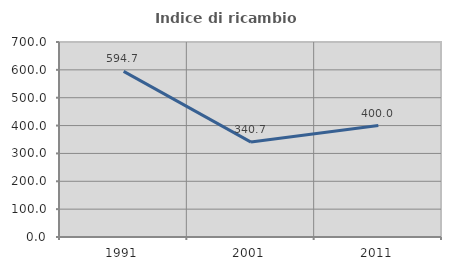
| Category | Indice di ricambio occupazionale  |
|---|---|
| 1991.0 | 594.737 |
| 2001.0 | 340.741 |
| 2011.0 | 400 |